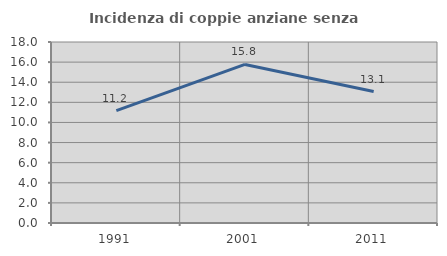
| Category | Incidenza di coppie anziane senza figli  |
|---|---|
| 1991.0 | 11.173 |
| 2001.0 | 15.771 |
| 2011.0 | 13.071 |